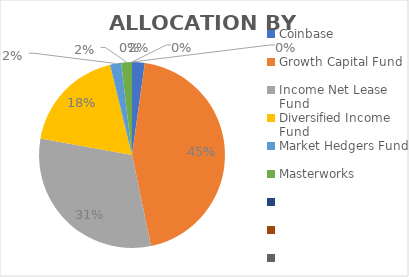
| Category | Expected Valuation |
|---|---|
| Coinbase | 44000 |
| Growth Capital Fund | 885000 |
| Income Net Lease Fund | 619000 |
| Diversified Income Fund | 365000 |
| Market Hedgers Fund | 38500 |
| Masterworks | 37000 |